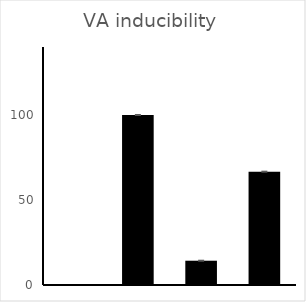
| Category | Inducibility |
|---|---|
| 0 | 0 |
| 1 | 100 |
| 2 | 14.286 |
| 3 | 66.667 |